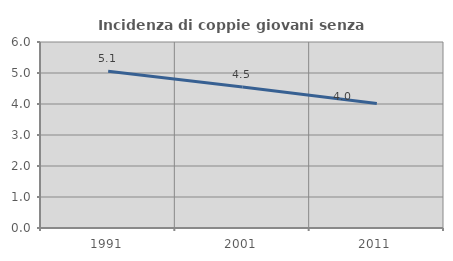
| Category | Incidenza di coppie giovani senza figli |
|---|---|
| 1991.0 | 5.055 |
| 2001.0 | 4.548 |
| 2011.0 | 4.02 |